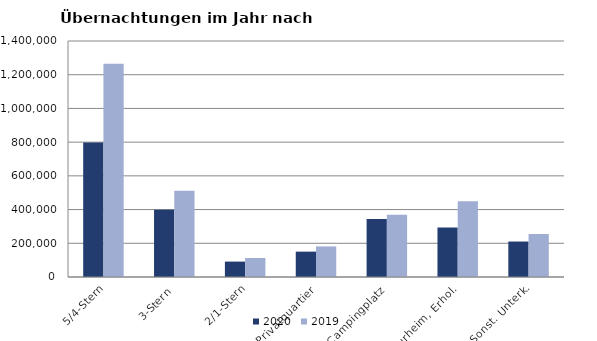
| Category | 2020 | 2019 |
|---|---|---|
| 5/4-Stern | 798332 | 1264746 |
| 3-Stern | 399606 | 512318 |
| 2/1-Stern | 91419 | 112611 |
| Privatquartier | 150470 | 181265 |
| Campingplatz | 344323 | 368801 |
| Kurheim, Erhol. | 293413 | 449652 |
| Sonst. Unterk. | 210373 | 254839 |